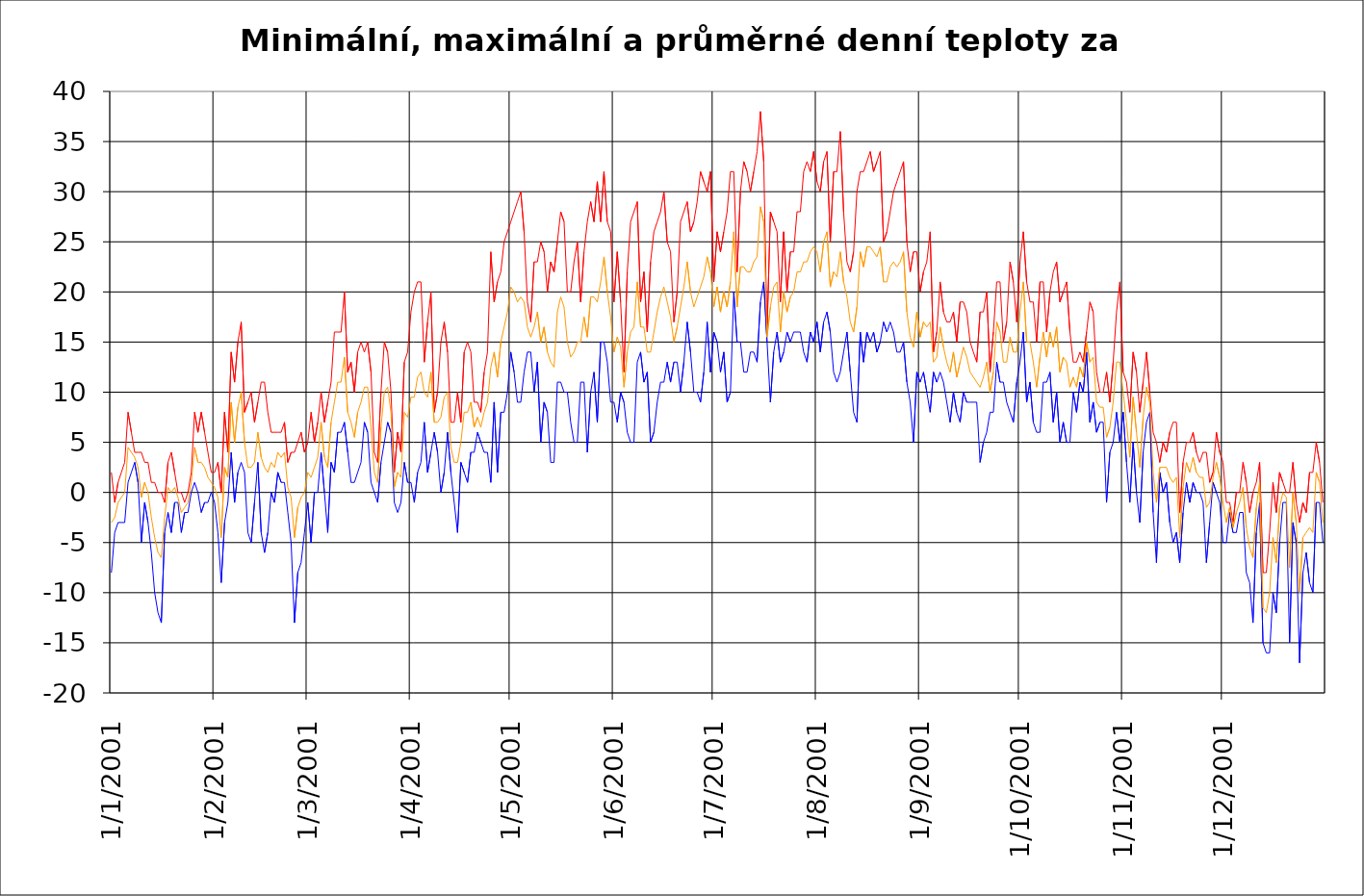
| Category | Series 0 | Series 1 | Series 2 |
|---|---|---|---|
| 2001-01-01 | -8 | 2 | -3 |
| 2001-01-02 | -4 | -1 | -2.5 |
| 2001-01-03 | -3 | 1 | -1 |
| 2001-01-04 | -3 | 2 | -0.5 |
| 2001-01-05 | -3 | 3 | 0 |
| 2001-01-06 | 1 | 8 | 4.5 |
| 2001-01-07 | 2 | 6 | 4 |
| 2001-01-08 | 3 | 4 | 3.5 |
| 2001-01-09 | 1 | 4 | 2.5 |
| 2001-01-10 | -5 | 4 | -0.5 |
| 2001-01-11 | -1 | 3 | 1 |
| 2001-01-12 | -3 | 3 | 0 |
| 2001-01-13 | -6 | 1 | -2.5 |
| 2001-01-14 | -10 | 1 | -4.5 |
| 2001-01-15 | -12 | 0 | -6 |
| 2001-01-16 | -13 | 0 | -6.5 |
| 2001-01-17 | -4 | -1 | -2.5 |
| 2001-01-18 | -2 | 3 | 0.5 |
| 2001-01-19 | -4 | 4 | 0 |
| 2001-01-20 | -1 | 2 | 0.5 |
| 2001-01-21 | -1 | 0 | -0.5 |
| 2001-01-22 | -4 | 0 | -2 |
| 2001-01-23 | -2 | -1 | -1.5 |
| 2001-01-24 | -2 | 0 | -1 |
| 2001-01-25 | 0 | 2 | 1 |
| 2001-01-26 | 1 | 8 | 4.5 |
| 2001-01-27 | 0 | 6 | 3 |
| 2001-01-28 | -2 | 8 | 3 |
| 2001-01-29 | -1 | 6 | 2.5 |
| 2001-01-30 | -1 | 4 | 1.5 |
| 2001-01-31 | 0 | 2 | 1 |
| 2001-02-01 | -1 | 2 | 0.5 |
| 2001-02-02 | -4 | 3 | -0.5 |
| 2001-02-03 | -9 | 0 | -4.5 |
| 2001-02-04 | -3 | 8 | 2.5 |
| 2001-02-05 | -1 | 4 | 1.5 |
| 2001-02-06 | 4 | 14 | 9 |
| 2001-02-07 | -1 | 11 | 5 |
| 2001-02-08 | 2 | 15 | 8.5 |
| 2001-02-09 | 3 | 17 | 10 |
| 2001-02-10 | 2 | 8 | 5 |
| 2001-02-11 | -4 | 9 | 2.5 |
| 2001-02-12 | -5 | 10 | 2.5 |
| 2001-02-13 | -1 | 7 | 3 |
| 2001-02-14 | 3 | 9 | 6 |
| 2001-02-15 | -4 | 11 | 3.5 |
| 2001-02-16 | -6 | 11 | 2.5 |
| 2001-02-17 | -4 | 8 | 2 |
| 2001-02-18 | 0 | 6 | 3 |
| 2001-02-19 | -1 | 6 | 2.5 |
| 2001-02-20 | 2 | 6 | 4 |
| 2001-02-21 | 1 | 6 | 3.5 |
| 2001-02-22 | 1 | 7 | 4 |
| 2001-02-23 | -2 | 3 | 0.5 |
| 2001-02-24 | -5 | 4 | -0.5 |
| 2001-02-25 | -13 | 4 | -4.5 |
| 2001-02-26 | -8 | 5 | -1.5 |
| 2001-02-27 | -7 | 6 | -0.5 |
| 2001-02-28 | -4 | 4 | 0 |
| 2001-03-01 | -1 | 5 | 2 |
| 2001-03-02 | -5 | 8 | 1.5 |
| 2001-03-03 | 0 | 5 | 2.5 |
| 2001-03-04 | 0 | 7 | 3.5 |
| 2001-03-05 | 4 | 10 | 7 |
| 2001-03-06 | 0 | 7 | 3.5 |
| 2001-03-07 | -4 | 9 | 2.5 |
| 2001-03-08 | 3 | 11 | 7 |
| 2001-03-09 | 2 | 16 | 9 |
| 2001-03-10 | 6 | 16 | 11 |
| 2001-03-11 | 6 | 16 | 11 |
| 2001-03-12 | 7 | 20 | 13.5 |
| 2001-03-13 | 4 | 12 | 8 |
| 2001-03-14 | 1 | 13 | 7 |
| 2001-03-15 | 1 | 10 | 5.5 |
| 2001-03-16 | 2 | 14 | 8 |
| 2001-03-17 | 3 | 15 | 9 |
| 2001-03-18 | 7 | 14 | 10.5 |
| 2001-03-19 | 6 | 15 | 10.5 |
| 2001-03-20 | 1 | 12 | 6.5 |
| 2001-03-21 | 0 | 4 | 2 |
| 2001-03-22 | -1 | 3 | 1 |
| 2001-03-23 | 3 | 10 | 6.5 |
| 2001-03-24 | 5 | 15 | 10 |
| 2001-03-25 | 7 | 14 | 10.5 |
| 2001-03-26 | 6 | 10 | 8 |
| 2001-03-27 | -1 | 2 | 0.5 |
| 2001-03-28 | -2 | 6 | 2 |
| 2001-03-29 | -1 | 4 | 1.5 |
| 2001-03-30 | 3 | 13 | 8 |
| 2001-03-31 | 1 | 14 | 7.5 |
| 2001-04-01 | 1 | 18 | 9.5 |
| 2001-04-02 | -1 | 20 | 9.5 |
| 2001-04-03 | 2 | 21 | 11.5 |
| 2001-04-04 | 3 | 21 | 12 |
| 2001-04-05 | 7 | 13 | 10 |
| 2001-04-06 | 2 | 17 | 9.5 |
| 2001-04-07 | 4 | 20 | 12 |
| 2001-04-08 | 6 | 8 | 7 |
| 2001-04-09 | 4 | 10 | 7 |
| 2001-04-10 | 0 | 15 | 7.5 |
| 2001-04-11 | 2 | 17 | 9.5 |
| 2001-04-12 | 6 | 14 | 10 |
| 2001-04-13 | 2 | 7 | 4.5 |
| 2001-04-14 | -1 | 7 | 3 |
| 2001-04-15 | -4 | 10 | 3 |
| 2001-04-16 | 3 | 7 | 5 |
| 2001-04-17 | 2 | 14 | 8 |
| 2001-04-18 | 1 | 15 | 8 |
| 2001-04-19 | 4 | 14 | 9 |
| 2001-04-20 | 4 | 9 | 6.5 |
| 2001-04-21 | 6 | 9 | 7.5 |
| 2001-04-22 | 5 | 8 | 6.5 |
| 2001-04-23 | 4 | 12 | 8 |
| 2001-04-24 | 4 | 14 | 9 |
| 2001-04-25 | 1 | 24 | 12.5 |
| 2001-04-26 | 9 | 19 | 14 |
| 2001-04-27 | 2 | 21 | 11.5 |
| 2001-04-28 | 8 | 22 | 15 |
| 2001-04-29 | 8 | 25 | 16.5 |
| 2001-04-30 | 10 | 26 | 18 |
| 2001-05-01 | 14 | 27 | 20.5 |
| 2001-05-02 | 12 | 28 | 20 |
| 2001-05-03 | 9 | 29 | 19 |
| 2001-05-04 | 9 | 30 | 19.5 |
| 2001-05-05 | 12 | 26 | 19 |
| 2001-05-06 | 14 | 19 | 16.5 |
| 2001-05-07 | 14 | 17 | 15.5 |
| 2001-05-08 | 10 | 23 | 16.5 |
| 2001-05-09 | 13 | 23 | 18 |
| 2001-05-10 | 5 | 25 | 15 |
| 2001-05-11 | 9 | 24 | 16.5 |
| 2001-05-12 | 8 | 20 | 14 |
| 2001-05-13 | 3 | 23 | 13 |
| 2001-05-14 | 3 | 22 | 12.5 |
| 2001-05-15 | 11 | 25 | 18 |
| 2001-05-16 | 11 | 28 | 19.5 |
| 2001-05-17 | 10 | 27 | 18.5 |
| 2001-05-18 | 10 | 20 | 15 |
| 2001-05-19 | 7 | 20 | 13.5 |
| 2001-05-20 | 5 | 23 | 14 |
| 2001-05-21 | 5 | 25 | 15 |
| 2001-05-22 | 11 | 19 | 15 |
| 2001-05-23 | 11 | 24 | 17.5 |
| 2001-05-24 | 4 | 27 | 15.5 |
| 2001-05-25 | 10 | 29 | 19.5 |
| 2001-05-26 | 12 | 27 | 19.5 |
| 2001-05-27 | 7 | 31 | 19 |
| 2001-05-28 | 15 | 27 | 21 |
| 2001-05-29 | 15 | 32 | 23.5 |
| 2001-05-30 | 13 | 27 | 20 |
| 2001-05-31 | 9 | 26 | 17.5 |
| 2001-06-01 | 9 | 19 | 14 |
| 2001-06-02 | 7 | 24 | 15.5 |
| 2001-06-03 | 10 | 19 | 14.5 |
| 2001-06-04 | 9 | 12 | 10.5 |
| 2001-06-05 | 6 | 22 | 14 |
| 2001-06-06 | 5 | 27 | 16 |
| 2001-06-07 | 5 | 28 | 16.5 |
| 2001-06-08 | 13 | 29 | 21 |
| 2001-06-09 | 14 | 19 | 16.5 |
| 2001-06-10 | 11 | 22 | 16.5 |
| 2001-06-11 | 12 | 16 | 14 |
| 2001-06-12 | 5 | 23 | 14 |
| 2001-06-13 | 6 | 26 | 16 |
| 2001-06-14 | 9 | 27 | 18 |
| 2001-06-15 | 11 | 28 | 19.5 |
| 2001-06-16 | 11 | 30 | 20.5 |
| 2001-06-17 | 13 | 25 | 19 |
| 2001-06-18 | 11 | 24 | 17.5 |
| 2001-06-19 | 13 | 17 | 15 |
| 2001-06-20 | 13 | 20 | 16.5 |
| 2001-06-21 | 10 | 27 | 18.5 |
| 2001-06-22 | 13 | 28 | 20.5 |
| 2001-06-23 | 17 | 29 | 23 |
| 2001-06-24 | 14 | 26 | 20 |
| 2001-06-25 | 10 | 27 | 18.5 |
| 2001-06-26 | 10 | 29 | 19.5 |
| 2001-06-27 | 9 | 32 | 20.5 |
| 2001-06-28 | 12 | 31 | 21.5 |
| 2001-06-29 | 17 | 30 | 23.5 |
| 2001-06-30 | 12 | 32 | 22 |
| 2001-07-01 | 16 | 21 | 18.5 |
| 2001-07-02 | 15 | 26 | 20.5 |
| 2001-07-03 | 12 | 24 | 18 |
| 2001-07-04 | 14 | 26 | 20 |
| 2001-07-05 | 9 | 28 | 18.5 |
| 2001-07-06 | 10 | 32 | 21 |
| 2001-07-07 | 20 | 32 | 26 |
| 2001-07-08 | 15 | 22 | 18.5 |
| 2001-07-09 | 15 | 30 | 22.5 |
| 2001-07-10 | 12 | 33 | 22.5 |
| 2001-07-11 | 12 | 32 | 22 |
| 2001-07-12 | 14 | 30 | 22 |
| 2001-07-13 | 14 | 32 | 23 |
| 2001-07-14 | 13 | 34 | 23.5 |
| 2001-07-15 | 19 | 38 | 28.5 |
| 2001-07-16 | 21 | 33 | 27 |
| 2001-07-17 | 15 | 16 | 15.5 |
| 2001-07-18 | 9 | 28 | 18.5 |
| 2001-07-19 | 14 | 27 | 20.5 |
| 2001-07-20 | 16 | 26 | 21 |
| 2001-07-21 | 13 | 19 | 16 |
| 2001-07-22 | 14 | 26 | 20 |
| 2001-07-23 | 16 | 20 | 18 |
| 2001-07-24 | 15 | 24 | 19.5 |
| 2001-07-25 | 16 | 24 | 20 |
| 2001-07-26 | 16 | 28 | 22 |
| 2001-07-27 | 16 | 28 | 22 |
| 2001-07-28 | 14 | 32 | 23 |
| 2001-07-29 | 13 | 33 | 23 |
| 2001-07-30 | 16 | 32 | 24 |
| 2001-07-31 | 15 | 34 | 24.5 |
| 2001-08-01 | 17 | 31 | 24 |
| 2001-08-02 | 14 | 30 | 22 |
| 2001-08-03 | 17 | 33 | 25 |
| 2001-08-04 | 18 | 34 | 26 |
| 2001-08-05 | 16 | 25 | 20.5 |
| 2001-08-06 | 12 | 32 | 22 |
| 2001-08-07 | 11 | 32 | 21.5 |
| 2001-08-08 | 12 | 36 | 24 |
| 2001-08-09 | 14 | 28 | 21 |
| 2001-08-10 | 16 | 23 | 19.5 |
| 2001-08-11 | 12 | 22 | 17 |
| 2001-08-12 | 8 | 24 | 16 |
| 2001-08-13 | 7 | 30 | 18.5 |
| 2001-08-14 | 16 | 32 | 24 |
| 2001-08-15 | 13 | 32 | 22.5 |
| 2001-08-16 | 16 | 33 | 24.5 |
| 2001-08-17 | 15 | 34 | 24.5 |
| 2001-08-18 | 16 | 32 | 24 |
| 2001-08-19 | 14 | 33 | 23.5 |
| 2001-08-20 | 15 | 34 | 24.5 |
| 2001-08-21 | 17 | 25 | 21 |
| 2001-08-22 | 16 | 26 | 21 |
| 2001-08-23 | 17 | 28 | 22.5 |
| 2001-08-24 | 16 | 30 | 23 |
| 2001-08-25 | 14 | 31 | 22.5 |
| 2001-08-26 | 14 | 32 | 23 |
| 2001-08-27 | 15 | 33 | 24 |
| 2001-08-28 | 11 | 25 | 18 |
| 2001-08-29 | 9 | 22 | 15.5 |
| 2001-08-30 | 5 | 24 | 14.5 |
| 2001-08-31 | 12 | 24 | 18 |
| 2001-09-01 | 11 | 20 | 15.5 |
| 2001-09-02 | 12 | 22 | 17 |
| 2001-09-03 | 10 | 23 | 16.5 |
| 2001-09-04 | 8 | 26 | 17 |
| 2001-09-05 | 12 | 14 | 13 |
| 2001-09-06 | 11 | 16 | 13.5 |
| 2001-09-07 | 12 | 21 | 16.5 |
| 2001-09-08 | 11 | 18 | 14.5 |
| 2001-09-09 | 9 | 17 | 13 |
| 2001-09-10 | 7 | 17 | 12 |
| 2001-09-11 | 10 | 18 | 14 |
| 2001-09-12 | 8 | 15 | 11.5 |
| 2001-09-13 | 7 | 19 | 13 |
| 2001-09-14 | 10 | 19 | 14.5 |
| 2001-09-15 | 9 | 18 | 13.5 |
| 2001-09-16 | 9 | 15 | 12 |
| 2001-09-17 | 9 | 14 | 11.5 |
| 2001-09-18 | 9 | 13 | 11 |
| 2001-09-19 | 3 | 18 | 10.5 |
| 2001-09-20 | 5 | 18 | 11.5 |
| 2001-09-21 | 6 | 20 | 13 |
| 2001-09-22 | 8 | 12 | 10 |
| 2001-09-23 | 8 | 16 | 12 |
| 2001-09-24 | 13 | 21 | 17 |
| 2001-09-25 | 11 | 21 | 16 |
| 2001-09-26 | 11 | 15 | 13 |
| 2001-09-27 | 9 | 17 | 13 |
| 2001-09-28 | 8 | 23 | 15.5 |
| 2001-09-29 | 7 | 21 | 14 |
| 2001-09-30 | 11 | 17 | 14 |
| 2001-10-01 | 13 | 23 | 18 |
| 2001-10-02 | 16 | 26 | 21 |
| 2001-10-03 | 9 | 21 | 15 |
| 2001-10-04 | 11 | 19 | 15 |
| 2001-10-05 | 7 | 19 | 13 |
| 2001-10-06 | 6 | 15 | 10.5 |
| 2001-10-07 | 6 | 21 | 13.5 |
| 2001-10-08 | 11 | 21 | 16 |
| 2001-10-09 | 11 | 16 | 13.5 |
| 2001-10-10 | 12 | 20 | 16 |
| 2001-10-11 | 7 | 22 | 14.5 |
| 2001-10-12 | 10 | 23 | 16.5 |
| 2001-10-13 | 5 | 19 | 12 |
| 2001-10-14 | 7 | 20 | 13.5 |
| 2001-10-15 | 5 | 21 | 13 |
| 2001-10-16 | 5 | 16 | 10.5 |
| 2001-10-17 | 10 | 13 | 11.5 |
| 2001-10-18 | 8 | 13 | 10.5 |
| 2001-10-19 | 11 | 14 | 12.5 |
| 2001-10-20 | 10 | 13 | 11.5 |
| 2001-10-21 | 14 | 16 | 15 |
| 2001-10-22 | 7 | 19 | 13 |
| 2001-10-23 | 9 | 18 | 13.5 |
| 2001-10-24 | 6 | 12 | 9 |
| 2001-10-25 | 7 | 10 | 8.5 |
| 2001-10-26 | 7 | 10 | 8.5 |
| 2001-10-27 | -1 | 12 | 5.5 |
| 2001-10-28 | 4 | 9 | 6.5 |
| 2001-10-29 | 5 | 13 | 9 |
| 2001-10-30 | 8 | 18 | 13 |
| 2001-10-31 | 5 | 21 | 13 |
| 2001-11-01 | 8 | 12 | 10 |
| 2001-11-02 | 3 | 11 | 7 |
| 2001-11-03 | -1 | 8 | 3.5 |
| 2001-11-04 | 5 | 14 | 9.5 |
| 2001-11-05 | 0 | 12 | 6 |
| 2001-11-06 | -3 | 8 | 2.5 |
| 2001-11-07 | 4 | 11 | 7.5 |
| 2001-11-08 | 7 | 14 | 10.5 |
| 2001-11-09 | 8 | 10 | 9 |
| 2001-11-10 | -2 | 6 | 2 |
| 2001-11-11 | -7 | 5 | -1 |
| 2001-11-12 | 2 | 3 | 2.5 |
| 2001-11-13 | 0 | 5 | 2.5 |
| 2001-11-14 | 1 | 4 | 2.5 |
| 2001-11-15 | -3 | 6 | 1.5 |
| 2001-11-16 | -5 | 7 | 1 |
| 2001-11-17 | -4 | 7 | 1.5 |
| 2001-11-18 | -7 | -2 | -4.5 |
| 2001-11-19 | -2 | 3 | 0.5 |
| 2001-11-20 | 1 | 5 | 3 |
| 2001-11-21 | -1 | 5 | 2 |
| 2001-11-22 | 1 | 6 | 3.5 |
| 2001-11-23 | 0 | 4 | 2 |
| 2001-11-24 | 0 | 3 | 1.5 |
| 2001-11-25 | -1 | 4 | 1.5 |
| 2001-11-26 | -7 | 4 | -1.5 |
| 2001-11-27 | -3 | 1 | -1 |
| 2001-11-28 | 1 | 2 | 1.5 |
| 2001-11-29 | 0 | 6 | 3 |
| 2001-11-30 | -1 | 4 | 1.5 |
| 2001-12-01 | -5 | 3 | -1 |
| 2001-12-02 | -5 | -1 | -3 |
| 2001-12-03 | -2 | -1 | -1.5 |
| 2001-12-04 | -4 | -3 | -3.5 |
| 2001-12-05 | -4 | 0 | -2 |
| 2001-12-06 | -2 | 0 | -1 |
| 2001-12-07 | -2 | 3 | 0.5 |
| 2001-12-08 | -8 | 1 | -3.5 |
| 2001-12-09 | -9 | -2 | -5.5 |
| 2001-12-10 | -13 | 0 | -6.5 |
| 2001-12-11 | -4 | 1 | -1.5 |
| 2001-12-12 | -1 | 3 | 1 |
| 2001-12-13 | -15 | -8 | -11.5 |
| 2001-12-14 | -16 | -8 | -12 |
| 2001-12-15 | -16 | -4 | -10 |
| 2001-12-16 | -10 | 1 | -4.5 |
| 2001-12-17 | -12 | -2 | -7 |
| 2001-12-18 | -5 | 2 | -1.5 |
| 2001-12-19 | -1 | 1 | 0 |
| 2001-12-20 | -1 | 0 | -0.5 |
| 2001-12-21 | -15 | 0 | -7.5 |
| 2001-12-22 | -3 | 3 | 0 |
| 2001-12-23 | -5 | -1 | -3 |
| 2001-12-24 | -17 | -3 | -10 |
| 2001-12-25 | -8 | -1 | -4.5 |
| 2001-12-26 | -6 | -2 | -4 |
| 2001-12-27 | -9 | 2 | -3.5 |
| 2001-12-28 | -10 | 2 | -4 |
| 2001-12-29 | -1 | 5 | 2 |
| 2001-12-30 | -1 | 3 | 1 |
| 2001-12-31 | -5 | -1 | -3 |